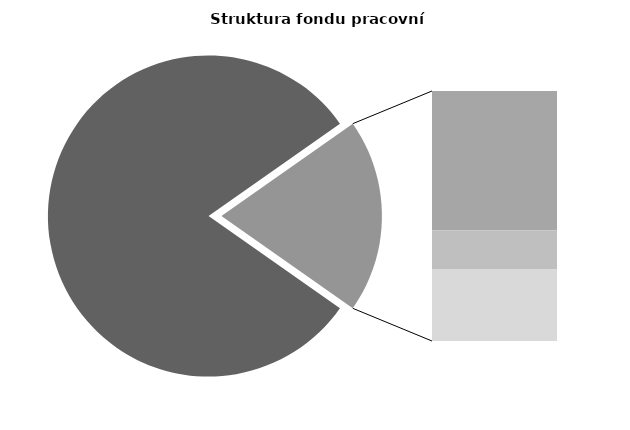
| Category | Series 0 |
|---|---|
| Průměrná měsíční odpracovaná doba bez přesčasu | 138.237 |
| Dovolená | 18.642 |
| Nemoc | 5.208 |
| Jiné | 9.635 |